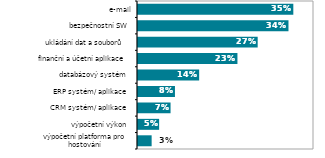
| Category | Series 0 |
|---|---|
| výpočetní platforma pro hostování 
prostředí pro vývoj aplikací | 0.031 |
| výpočetní výkon | 0.048 |
| CRM systém/ aplikace | 0.074 |
| ERP systém/ aplikace | 0.084 |
| databázový systém | 0.139 |
| finanční a účetní aplikace | 0.226 |
| ukládání dat a souborů  | 0.272 |
| bezpečnostní SW | 0.342 |
| e-mail | 0.353 |